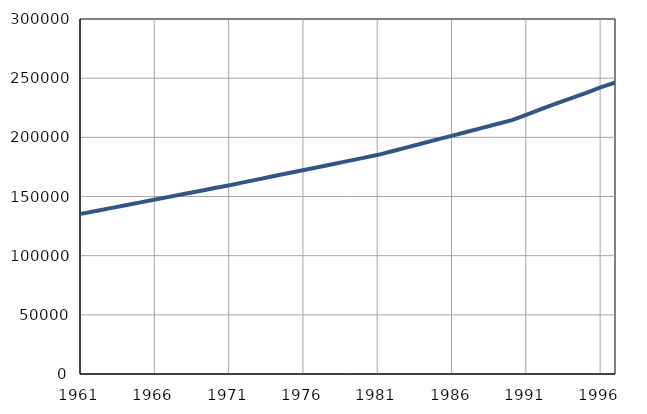
| Category | Број
становника |
|---|---|
| 1961.0 | 135329 |
| 1962.0 | 137753 |
| 1963.0 | 140177 |
| 1964.0 | 142601 |
| 1965.0 | 145025 |
| 1966.0 | 147449 |
| 1967.0 | 149873 |
| 1968.0 | 152297 |
| 1969.0 | 154721 |
| 1970.0 | 157145 |
| 1971.0 | 159561 |
| 1972.0 | 162128 |
| 1973.0 | 164695 |
| 1974.0 | 167262 |
| 1975.0 | 169829 |
| 1976.0 | 172396 |
| 1977.0 | 174963 |
| 1978.0 | 177530 |
| 1979.0 | 180097 |
| 1980.0 | 182664 |
| 1981.0 | 185228 |
| 1982.0 | 188478 |
| 1983.0 | 191728 |
| 1984.0 | 194978 |
| 1985.0 | 198228 |
| 1986.0 | 201478 |
| 1987.0 | 204728 |
| 1988.0 | 207978 |
| 1989.0 | 211228 |
| 1990.0 | 214478 |
| 1991.0 | 219100 |
| 1992.0 | 224000 |
| 1993.0 | 228700 |
| 1994.0 | 233200 |
| 1995.0 | 237600 |
| 1996.0 | 242400 |
| 1997.0 | 246500 |